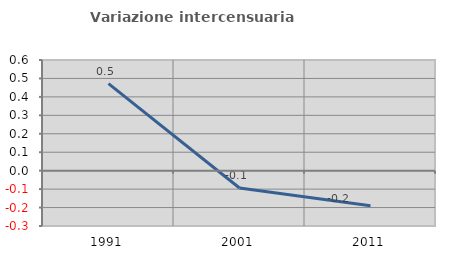
| Category | Variazione intercensuaria annua |
|---|---|
| 1991.0 | 0.472 |
| 2001.0 | -0.094 |
| 2011.0 | -0.19 |